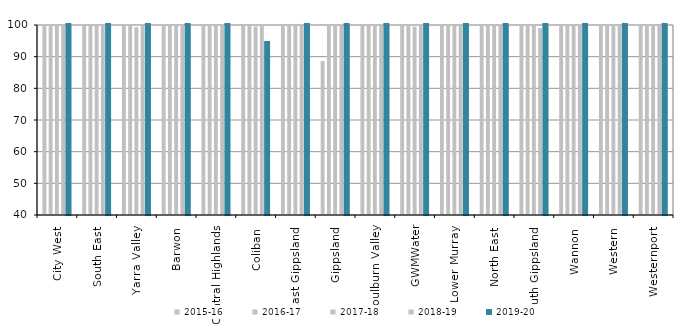
| Category | 2015-16 | 2016-17 | 2017-18 | 2018-19 | 2019-20 |
|---|---|---|---|---|---|
| City West  | 100 | 100 | 100 | 100 | 100 |
| South East  | 100 | 100 | 100 | 100 | 100 |
| Yarra Valley  | 100 | 100 | 99.314 | 100 | 100 |
| Barwon  | 100 | 99.999 | 100 | 100 | 100 |
| Central Highlands  | 100 | 100 | 99.691 | 100 | 100 |
| Coliban  | 100 | 100 | 99.5 | 100 | 94.3 |
| East Gippsland  | 100 | 100 | 100 | 100 | 100 |
| Gippsland  | 88.6 | 100 | 100 | 100 | 100 |
| Goulburn Valley  | 100 | 100 | 100 | 100 | 100 |
| GWMWater | 100 | 100 | 99.43 | 100 | 100 |
| Lower Murray  | 100 | 100 | 100 | 100 | 100 |
| North East  | 100 | 100 | 100 | 100 | 100 |
| South Gippsland  | 100 | 100 | 100 | 99.04 | 100 |
| Wannon  | 100 | 99.8 | 100 | 100 | 100 |
| Western  | 100 | 99.8 | 100 | 99.91 | 100 |
| Westernport  | 100 | 100 | 100 | 100 | 100 |